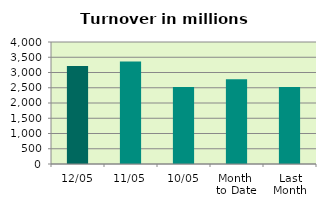
| Category | Series 0 |
|---|---|
| 12/05 | 3214.293 |
| 11/05 | 3364.099 |
| 10/05 | 2522.656 |
| Month 
to Date | 2779.842 |
| Last
Month | 2525.558 |